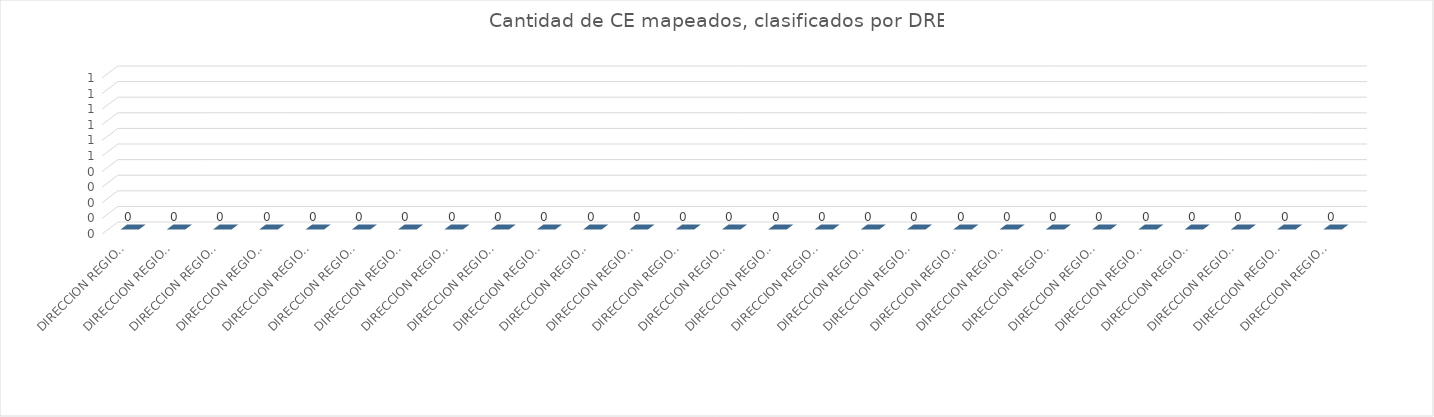
| Category | Series 0 |
|---|---|
| DIRECCION REGIONAL AGUIRRE | 0 |
| DIRECCION REGIONAL LIBERIA | 0 |
| DIRECCION REGIONAL LOS SANTOS | 0 |
| DIRECCION REGIONAL CAÑAS | 0 |
| DIRECCION REGIONAL PENINSULAR | 0 |
| DIRECCION REGIONAL PÉREZ ZELEDÓN | 0 |
| DIRECCION REGIONAL PUNTARENAS | 0 |
| DIRECCION REGIONAL CARTAGO | 0 |
| DIRECCION REGIONAL DESAMPARADOS | 0 |
| DIRECCION REGIONAL PURISCAL | 0 |
| DIRECCION REGIONAL SAN JOSE CENTRAL | 0 |
| DIRECCION REGIONAL SAN JOSE OESTE | 0 |
| DIRECCION REGIONAL SULA | 0 |
| DIRECCION REGIONAL TURRIALBA | 0 |
| DIRECCION REGIONAL ALAJUELA | 0 |
| DIRECCION REGIONAL COTO | 0 |
| DIRECCION REGIONAL HEREDIA | 0 |
| DIRECCION REGIONAL LIMON | 0 |
| DIRECCION REGIONAL GUAPILES | 0 |
| DIRECCION REGIONAL SAN JOSE NORTE | 0 |
| DIRECCION REGIONAL GRANDE DE TERRABA | 0 |
| DIRECCION REGIONAL NICOYA | 0 |
| DIRECCION REGIONAL ZONA NORTE NORTE | 0 |
| DIRECCION REGIONAL SAN CARLOS | 0 |
| DIRECCION REGIONAL SANTA CRUZ | 0 |
| DIRECCION REGIONAL SARAPIQUI | 0 |
| DIRECCION REGIONAL OCCIDENTE | 0 |